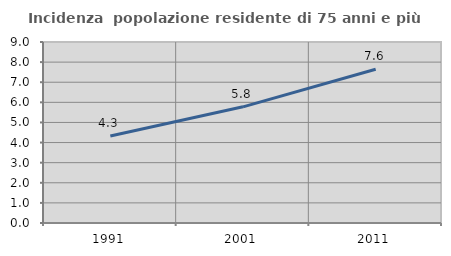
| Category | Incidenza  popolazione residente di 75 anni e più |
|---|---|
| 1991.0 | 4.324 |
| 2001.0 | 5.777 |
| 2011.0 | 7.646 |